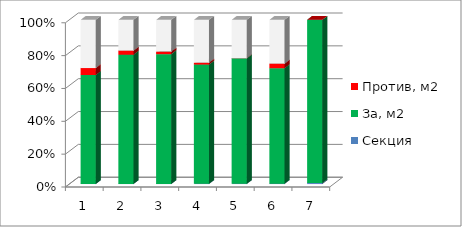
| Category | Секция | За, м2 | Против, м2 | Возд., м2 |
|---|---|---|---|---|
| 0 | 1 | 2337.273 | 149.5 | 1033.239 |
| 1 | 2 | 2690.78 | 84.8 | 640.9 |
| 2 | 3 | 2946.044 | 58.475 | 720.15 |
| 3 | 4 | 2256.49 | 34.4 | 810.99 |
| 4 | 5 | 2755.73 | 0 | 843.27 |
| 5 | 6 | 1665.6 | 66 | 631.75 |
| 6 | 7 | 1110.4 | 0 | 0 |